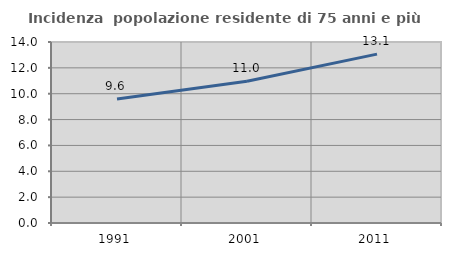
| Category | Incidenza  popolazione residente di 75 anni e più |
|---|---|
| 1991.0 | 9.59 |
| 2001.0 | 10.965 |
| 2011.0 | 13.06 |